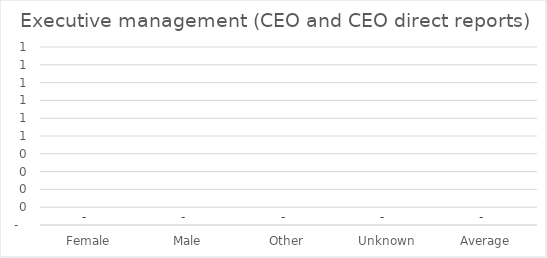
| Category | Series 0 |
|---|---|
| Female | 0 |
| Male | 0 |
| Other | 0 |
| Unknown | 0 |
| Average | 0 |